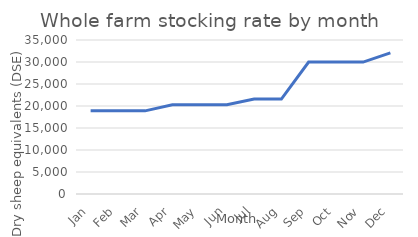
| Category | Series 0 |
|---|---|
| Jan | 18900 |
| Feb | 18900 |
| Mar | 18900 |
| Apr | 20275 |
| May | 20275 |
| Jun | 20275 |
| Jul | 21575 |
| Aug | 21575 |
| Sep | 29975 |
| Oct | 29975 |
| Nov | 29975 |
| Dec | 32075 |